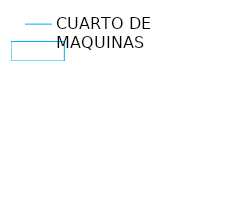
| Category | CUARTO DE MAQUINAS |
|---|---|
| 0.0 | 0 |
| 1.0 | 0 |
| 1.0 | 1 |
| 0.0 | 1 |
| 0.0 | 0 |